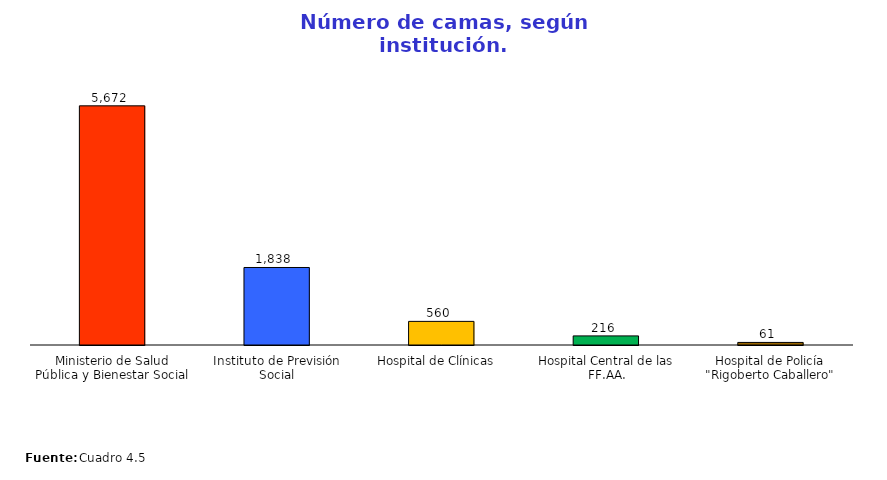
| Category | Series 0 |
|---|---|
| Ministerio de Salud Pública y Bienestar Social | 5672 |
| Instituto de Previsión Social | 1838 |
| Hospital de Clínicas   | 560 |
| Hospital Central de las FF.AA. | 216 |
| Hospital de Policía "Rigoberto Caballero" | 61 |